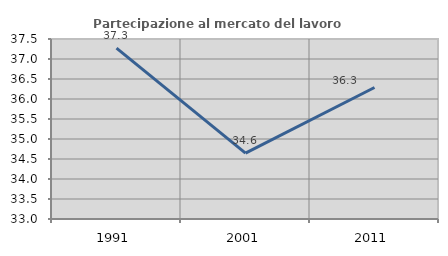
| Category | Partecipazione al mercato del lavoro  femminile |
|---|---|
| 1991.0 | 37.273 |
| 2001.0 | 34.645 |
| 2011.0 | 36.288 |